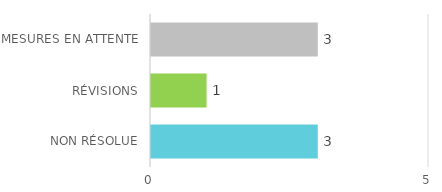
| Category | Series 1 |
|---|---|
| NON RÉSOLUE | 3 |
| RÉVISIONS | 1 |
| MESURES EN ATTENTE | 3 |